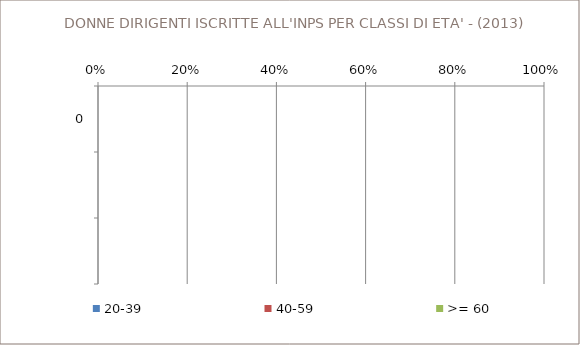
| Category | 20-39 | 40-59 | >= 60 |
|---|---|---|---|
| 0 | 0 | 0 | 0 |